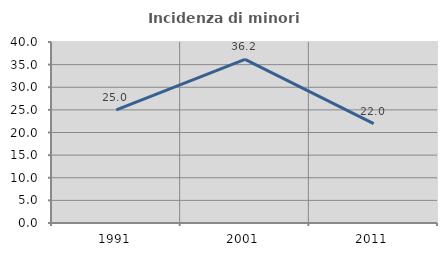
| Category | Incidenza di minori stranieri |
|---|---|
| 1991.0 | 25 |
| 2001.0 | 36.17 |
| 2011.0 | 21.951 |